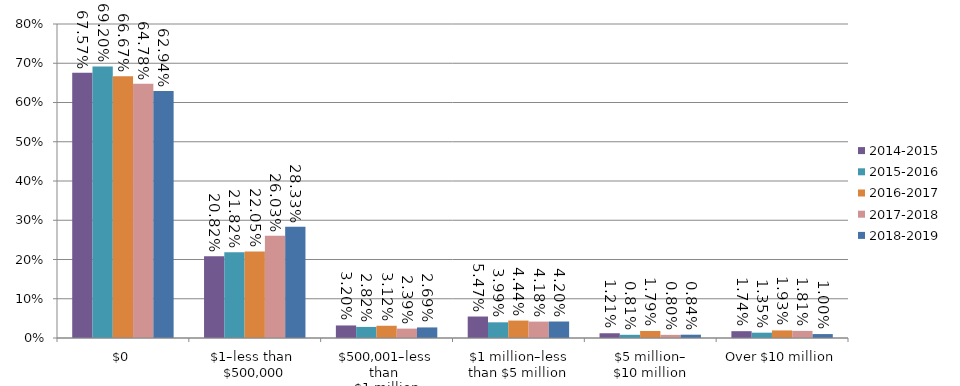
| Category | 2014-2015 | 2015-2016 | 2016-2017 | 2017-2018 | 2018-2019 |
|---|---|---|---|---|---|
| $0 | 0.676 | 0.692 | 0.667 | 0.648 | 0.629 |
| $1–less than 
$500,000 | 0.208 | 0.218 | 0.22 | 0.26 | 0.283 |
| $500,001–less than 
$1 million | 0.032 | 0.028 | 0.031 | 0.024 | 0.027 |
| $1 million–less than $5 million | 0.055 | 0.04 | 0.044 | 0.042 | 0.042 |
| $5 million–
$10 million | 0.012 | 0.008 | 0.018 | 0.008 | 0.008 |
| Over $10 million | 0.017 | 0.014 | 0.019 | 0.018 | 0.01 |